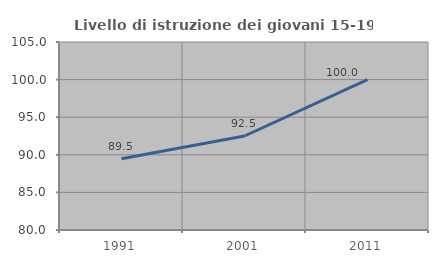
| Category | Livello di istruzione dei giovani 15-19 anni |
|---|---|
| 1991.0 | 89.474 |
| 2001.0 | 92.5 |
| 2011.0 | 100 |